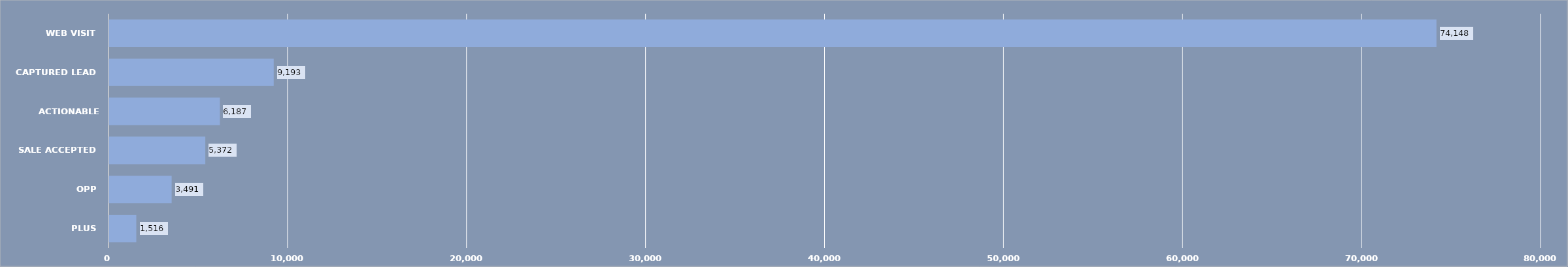
| Category | Series 0 |
|---|---|
| PLUS | 1516 |
| OPP | 3491 |
| SALE ACCEPTED | 5372 |
| ACTIONABLE LEAD | 6187 |
| CAPTURED LEAD | 9193 |
| WEB VISIT | 74148 |